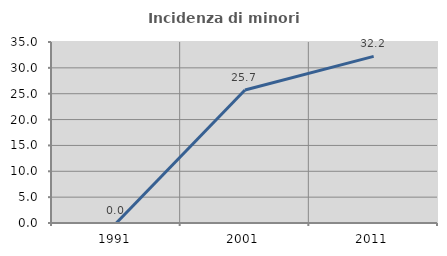
| Category | Incidenza di minori stranieri |
|---|---|
| 1991.0 | 0 |
| 2001.0 | 25.714 |
| 2011.0 | 32.22 |